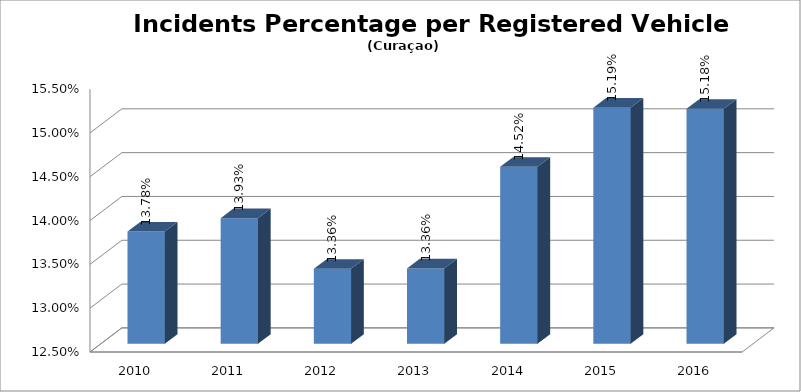
| Category | Series 0 |
|---|---|
| 2010.0 | 0.138 |
| 2011.0 | 0.139 |
| 2012.0 | 0.134 |
| 2013.0 | 0.134 |
| 2014.0 | 0.145 |
| 2015.0 | 0.152 |
| 2016.0 | 0.152 |